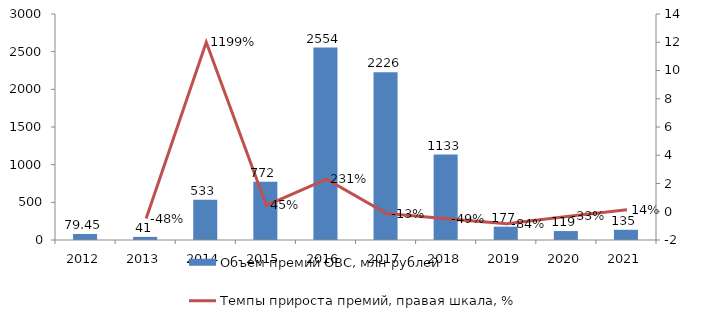
| Category | Объем премий ОВС, млн рублей |
|---|---|
| 2012.0 | 79.45 |
| 2013.0 | 41.023 |
| 2014.0 | 533.032 |
| 2015.0 | 772.336 |
| 2016.0 | 2553.974 |
| 2017.0 | 2225.838 |
| 2018.0 | 1133.489 |
| 2019.0 | 176.995 |
| 2020.0 | 118.676 |
| 2021.0 | 135.431 |